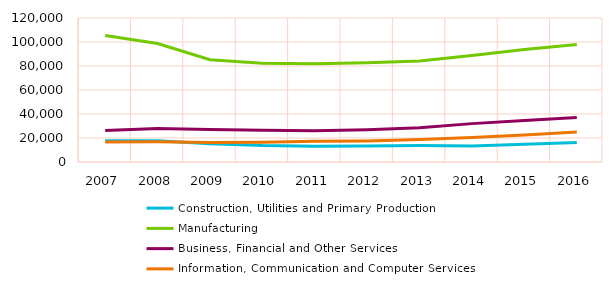
| Category | Construction, Utilities and Primary Production | Manufacturing | Business, Financial and Other Services | Information, Communication and Computer Services |
|---|---|---|---|---|
| 2007.0 | 17638 | 105424 | 26275 | 16569 |
| 2008.0 | 17705 | 98712 | 27991 | 16775 |
| 2009.0 | 15261 | 85184 | 27010 | 16244 |
| 2010.0 | 13668 | 82194 | 26420 | 16479 |
| 2011.0 | 13144 | 81927 | 26070 | 17323 |
| 2012.0 | 13423 | 82710 | 26879 | 17578 |
| 2013.0 | 13669 | 84145 | 28622 | 18733 |
| 2014.0 | 13369 | 88721 | 31976 | 20352 |
| 2015.0 | 14789 | 93838 | 34622 | 22511 |
| 2016.0 | 16210 | 97928 | 37043 | 25090 |